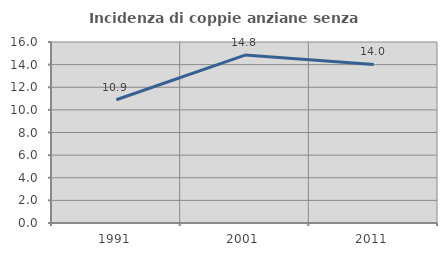
| Category | Incidenza di coppie anziane senza figli  |
|---|---|
| 1991.0 | 10.895 |
| 2001.0 | 14.844 |
| 2011.0 | 14.015 |